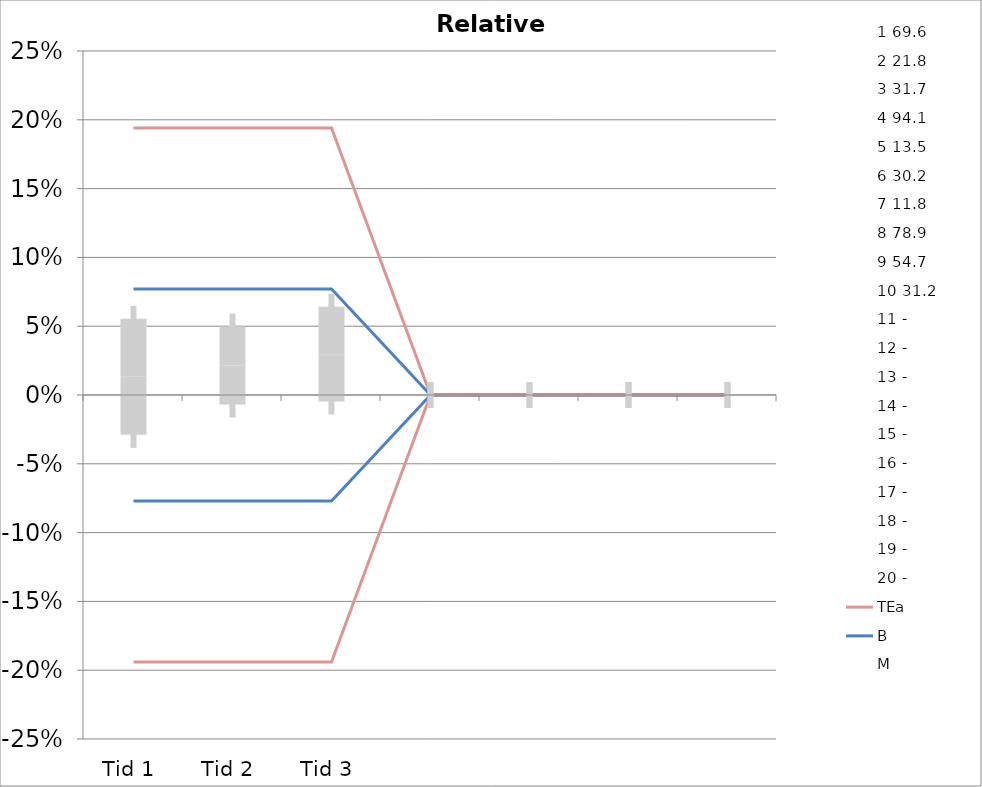
| Category | 1 | 2 | 3 | 4 | 5 | 6 | 7 | 8 | 9 | 10 | 11 | 12 | 13 | 14 | 15 | 16 | 17 | 18 | 19 | 20 | TEa | B | -B | -TEa | M |
|---|---|---|---|---|---|---|---|---|---|---|---|---|---|---|---|---|---|---|---|---|---|---|---|---|---|
| Tid 1 | -0.03 | -0.009 | 0.054 | 0.056 | -0.081 | 0.093 | 0.042 | -0.008 | -0.059 | 0.074 | 0 | 0 | 0 | 0 | 0 | 0 | 0 | 0 | 0 | 0 | 0.194 | 0.077 | -0.077 | -0.194 | 0.013 |
| Tid 2 | -0.024 | 0.005 | 0.054 | 0.024 | -0.007 | 0.093 | 0.025 | -0.005 | -0.02 | 0.071 | 0 | 0 | 0 | 0 | 0 | 0 | 0 | 0 | 0 | 0 | 0.194 | 0.077 | -0.077 | -0.194 | 0.021 |
| Tid 3 | -0.01 | 0.018 | 0.054 | 0.061 | 0.074 | 0.079 | 0.034 | 0.029 | -0.084 | 0.042 | 0 | 0 | 0 | 0 | 0 | 0 | 0 | 0 | 0 | 0 | 0.194 | 0.077 | -0.077 | -0.194 | 0.03 |